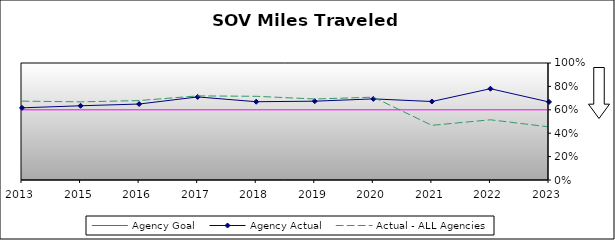
| Category | Agency Goal | Agency Actual | Actual - ALL Agencies |
|---|---|---|---|
| 2013.0 | 0.6 | 0.617 | 0.674 |
| 2015.0 | 0.6 | 0.634 | 0.668 |
| 2016.0 | 0.6 | 0.649 | 0.679 |
| 2017.0 | 0.6 | 0.71 | 0.719 |
| 2018.0 | 0.6 | 0.669 | 0.715 |
| 2019.0 | 0.6 | 0.674 | 0.692 |
| 2020.0 | 0.6 | 0.693 | 0.708 |
| 2021.0 | 0.6 | 0.671 | 0.467 |
| 2022.0 | 0.6 | 0.78 | 0.515 |
| 2023.0 | 0.6 | 0.667 | 0.454 |